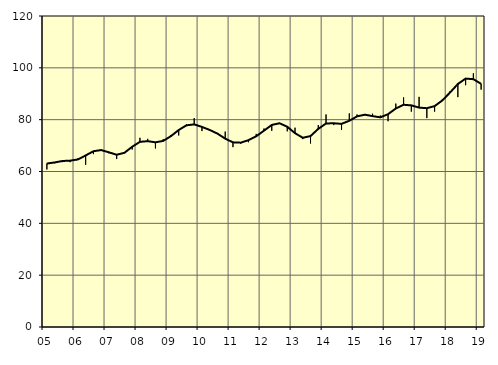
| Category | Trend | Originalvärden |
|---|---|---|
| 5.0 | 63.07 | 60.8 |
| nan | 63.49 | 63.2 |
| 6.0 | 64.05 | 63.6 |
| 6.0 | 64.19 | 63.6 |
| 6.0 | 64.64 | 65.1 |
| nan | 66.19 | 62.6 |
| 7.0 | 67.82 | 66.7 |
| 7.0 | 68.27 | 68.5 |
| 7.0 | 67.4 | 67 |
| nan | 66.46 | 64.8 |
| 8.0 | 67.21 | 67.1 |
| 8.0 | 69.55 | 68.5 |
| 8.0 | 71.44 | 73 |
| nan | 71.71 | 72.6 |
| 9.0 | 71.26 | 68.9 |
| 9.0 | 71.8 | 72.5 |
| 9.0 | 73.65 | 74.1 |
| nan | 76.01 | 73.9 |
| 10.0 | 77.82 | 78.3 |
| 10.0 | 78.18 | 80.6 |
| 10.0 | 77.2 | 75.6 |
| nan | 76.03 | 75.8 |
| 11.0 | 74.61 | 74.8 |
| 11.0 | 72.67 | 75.4 |
| 11.0 | 71.25 | 69.4 |
| nan | 71.13 | 70.8 |
| 12.0 | 72.09 | 71.3 |
| 12.0 | 73.59 | 74.5 |
| 12.0 | 75.77 | 76.6 |
| nan | 77.96 | 75.7 |
| 13.0 | 78.62 | 78.6 |
| 13.0 | 77.27 | 75.5 |
| 13.0 | 74.79 | 76.9 |
| nan | 73.02 | 72.5 |
| 14.0 | 73.67 | 70.8 |
| 14.0 | 76.45 | 77.9 |
| 14.0 | 78.53 | 82 |
| nan | 78.61 | 77.9 |
| 15.0 | 78.38 | 76 |
| 15.0 | 79.57 | 82.4 |
| 15.0 | 81.27 | 82 |
| nan | 81.92 | 81.7 |
| 16.0 | 81.37 | 82.3 |
| 16.0 | 80.9 | 81.6 |
| 16.0 | 82.12 | 79.4 |
| nan | 84.31 | 86.2 |
| 17.0 | 85.75 | 88.6 |
| 17.0 | 85.52 | 83.1 |
| 17.0 | 84.65 | 88.8 |
| nan | 84.43 | 80.6 |
| 18.0 | 85.23 | 83.1 |
| 18.0 | 87.42 | 87.9 |
| 18.0 | 90.5 | 91 |
| nan | 93.76 | 88.7 |
| 19.0 | 95.85 | 93.3 |
| 19.0 | 95.62 | 97.9 |
| 19.0 | 93.82 | 91.6 |